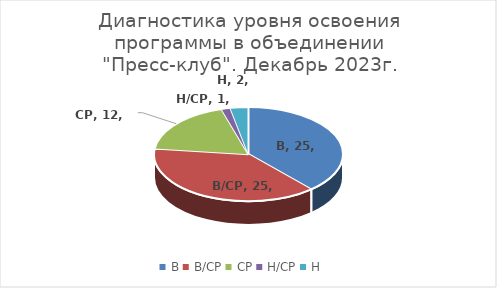
| Category | Series 0 |
|---|---|
| В | 25 |
| В/СР | 25 |
| СР | 12 |
| Н/СР | 1 |
| Н | 2 |